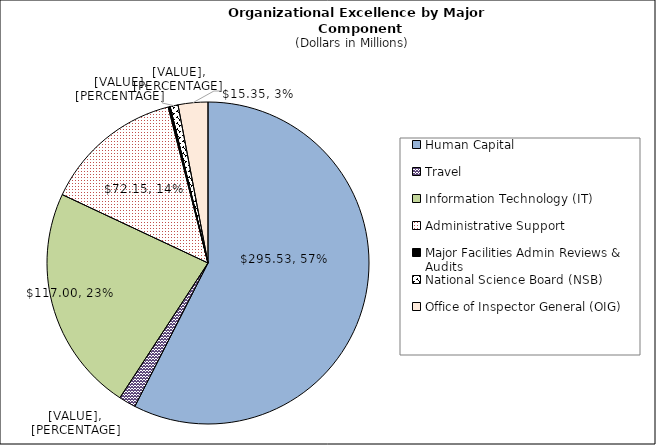
| Category |  Organizational Excellence by Major Component  |
|---|---|
| Human Capital | 295.525 |
| Travel | 8.78 |
| Information Technology (IT) | 117 |
| Administrative Support | 72.146 |
| Major Facilities Admin Reviews & Audits | 1 |
| NSF Headquarters Relocation | 0 |
| National Science Board (NSB) | 4.1 |
| Office of Inspector General (OIG) | 15.35 |